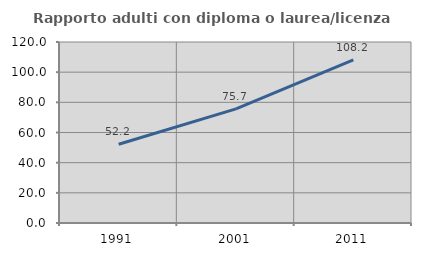
| Category | Rapporto adulti con diploma o laurea/licenza media  |
|---|---|
| 1991.0 | 52.203 |
| 2001.0 | 75.702 |
| 2011.0 | 108.153 |